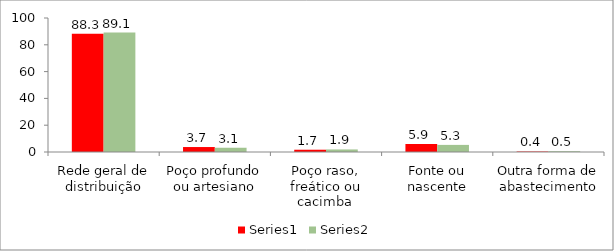
| Category | Series 0 | Series 1 |
|---|---|---|
| Rede geral de distribuição | 88.3 | 89.1 |
| Poço profundo ou artesiano | 3.7 | 3.1 |
| Poço raso, freático ou cacimba | 1.7 | 1.9 |
| Fonte ou nascente | 5.9 | 5.3 |
| Outra forma de abastecimento | 0.4 | 0.5 |